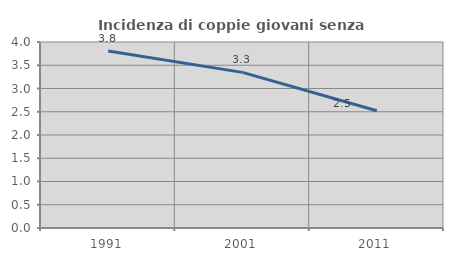
| Category | Incidenza di coppie giovani senza figli |
|---|---|
| 1991.0 | 3.808 |
| 2001.0 | 3.347 |
| 2011.0 | 2.522 |